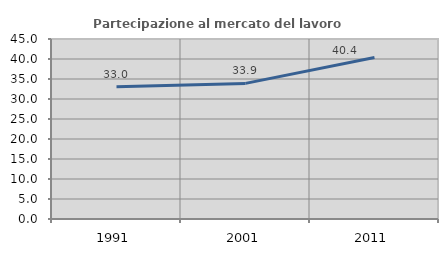
| Category | Partecipazione al mercato del lavoro  femminile |
|---|---|
| 1991.0 | 33.049 |
| 2001.0 | 33.904 |
| 2011.0 | 40.354 |